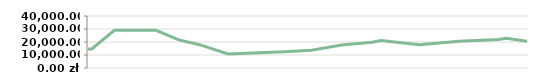
| Category | MIESIĄC   |
|---|---|
| 2013-04-23 | 14600 |
| 2013-04-25 | 14600 |
| 2013-05-07 | 29000 |
| 2013-05-14 | 29000 |
| 2013-05-14 | 29000 |
| 2013-05-29 | 29000 |
| 2013-06-10 | 21600 |
| 2013-06-21 | 17950 |
| 2013-07-06 | 10776.471 |
| 2013-08-05 | 12455.862 |
| 2013-08-19 | 13667.568 |
| 2013-09-04 | 17651.667 |
| 2013-09-20 | 19877.912 |
| 2013-09-25 | 21138.05 |
| 2013-10-15 | 17951.744 |
| 2013-11-05 | 20556.13 |
| 2013-11-26 | 21997.139 |
| 2013-11-30 | 22917.635 |
| 2013-12-11 | 20504.315 |